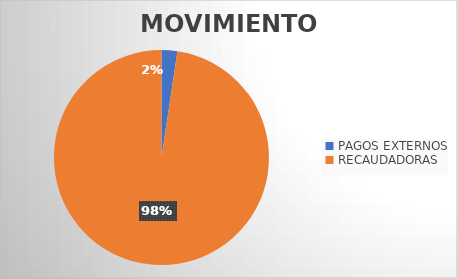
| Category | MOVIMIENTOS |
|---|---|
| PAGOS EXTERNOS | 550 |
| RECAUDADORAS | 22650 |